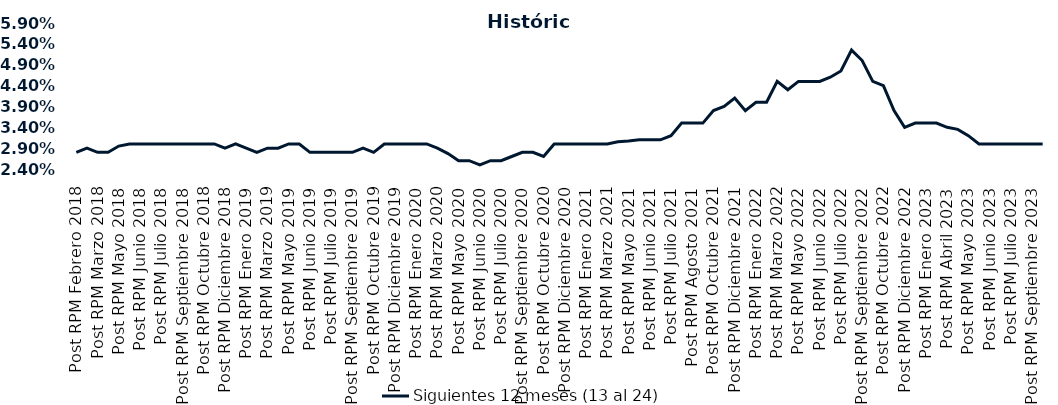
| Category | Siguientes 12 meses (13 al 24)  |
|---|---|
| Post RPM Febrero 2018 | 0.028 |
| Pre RPM Marzo 2018 | 0.029 |
| Post RPM Marzo 2018 | 0.028 |
| Pre RPM Mayo 2018 | 0.028 |
| Post RPM Mayo 2018 | 0.03 |
| Pre RPM Junio 2018 | 0.03 |
| Post RPM Junio 2018 | 0.03 |
| Pre RPM Julio 2018 | 0.03 |
| Post RPM Julio 2018 | 0.03 |
| Pre RPM Septiembre 2018 | 0.03 |
| Post RPM Septiembre 2018 | 0.03 |
| Pre RPM Octubre 2018 | 0.03 |
| Post RPM Octubre 2018 | 0.03 |
| Pre RPM Diciembre 2018 | 0.03 |
| Post RPM Diciembre 2018 | 0.029 |
| Pre RPM Enero 2019 | 0.03 |
| Post RPM Enero 2019 | 0.029 |
| Pre RPM Marzo 2019 | 0.028 |
| Post RPM Marzo 2019 | 0.029 |
| Pre RPM Mayo 2019 | 0.029 |
| Post RPM Mayo 2019 | 0.03 |
| Pre RPM Junio 2019 | 0.03 |
| Post RPM Junio 2019 | 0.028 |
| Pre RPM Julio 2019 | 0.028 |
| Post RPM Julio 2019 | 0.028 |
| Pre RPM Septiembre 2019 | 0.028 |
| Post RPM Septiembre 2019 | 0.028 |
| Pre RPM Octubre 2019 | 0.029 |
| Post RPM Octubre 2019 | 0.028 |
| Pre RPM Diciembre 2019 | 0.03 |
| Post RPM Diciembre 2019 | 0.03 |
| Pre RPM Enero 2020 | 0.03 |
| Post RPM Enero 2020 | 0.03 |
| Pre RPM Marzo 2020 | 0.03 |
| Post RPM Marzo 2020 | 0.029 |
| Pre RPM Mayo 2020 | 0.028 |
| Post RPM Mayo 2020 | 0.026 |
| Pre RPM Junio 2020 | 0.026 |
| Post RPM Junio 2020 | 0.025 |
| Pre RPM Julio 2020 | 0.026 |
| Post RPM Julio 2020 | 0.026 |
| Pre RPM Septiembre 2020 | 0.027 |
| Post RPM Septiembre 2020 | 0.028 |
| Pre RPM Octubre 2020 | 0.028 |
| Post RPM Octubre 2020 | 0.027 |
| Pre RPM Diciembre 2020 | 0.03 |
| Post RPM Diciembre 2020 | 0.03 |
| Pre RPM Enero 2021 | 0.03 |
| Post RPM Enero 2021 | 0.03 |
| Pre RPM Marzo 2021 | 0.03 |
| Post RPM Marzo 2021 | 0.03 |
| Pre RPM Mayo 2021 | 0.031 |
| Post RPM Mayo 2021 | 0.031 |
| Pre RPM Junio 2021 | 0.031 |
| Post RPM Junio 2021 | 0.031 |
| Pre RPM Julio 2021 | 0.031 |
| Post RPM Julio 2021 | 0.032 |
| Pre RPM Agosto 2021 | 0.035 |
| Post RPM Agosto 2021 | 0.035 |
| Pre RPM Octubre 2021 | 0.035 |
| Post RPM Octubre 2021 | 0.038 |
| Pre RPM Diciembre 2021 | 0.039 |
| Post RPM Diciembre 2021 | 0.041 |
| Pre RPM Enero 2022 | 0.038 |
| Post RPM Enero 2022 | 0.04 |
| Pre RPM Marzo 2022 | 0.04 |
| Post RPM Marzo 2022 | 0.045 |
| Pre RPM Mayo 2022 | 0.043 |
| Post RPM Mayo 2022 | 0.045 |
| Pre RPM Junio 2022 | 0.045 |
| Post RPM Junio 2022 | 0.045 |
| Pre RPM Julio 2022 | 0.046 |
| Post RPM Julio 2022 | 0.048 |
| Pre RPM Septiembre 2022 | 0.052 |
| Post RPM Septiembre 2022 | 0.05 |
| Pre RPM Octubre 2022 | 0.045 |
| Post RPM Octubre 2022 | 0.044 |
| Pre RPM Diciembre 2022 | 0.038 |
| Post RPM Diciembre 2022 | 0.034 |
| Pre RPM Enero 2023 | 0.035 |
| Post RPM Enero 2023 | 0.035 |
| Pre RPM Abril 2023 | 0.035 |
| Post RPM Abril 2023 | 0.034 |
| Pre RPM Mayo 2023 | 0.034 |
| Post RPM Mayo 2023 | 0.032 |
| Pre RPM Junio 2023 | 0.03 |
| Post RPM Junio 2023 | 0.03 |
| Pre RPM Julio 2023 | 0.03 |
| Post RPM Julio 2023 | 0.03 |
| Pre RPM Septiembre 2023 | 0.03 |
| Post RPM Septiembre 2023 | 0.03 |
| Pre RPM Octubre 2023 | 0.03 |